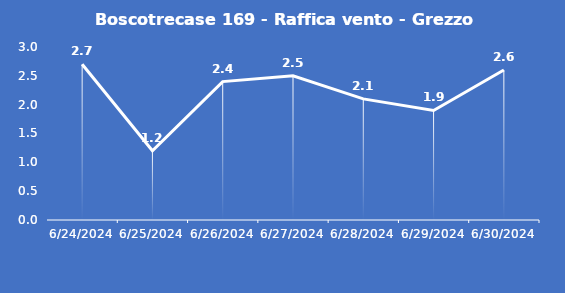
| Category | Boscotrecase 169 - Raffica vento - Grezzo (m/s) |
|---|---|
| 6/24/24 | 2.7 |
| 6/25/24 | 1.2 |
| 6/26/24 | 2.4 |
| 6/27/24 | 2.5 |
| 6/28/24 | 2.1 |
| 6/29/24 | 1.9 |
| 6/30/24 | 2.6 |